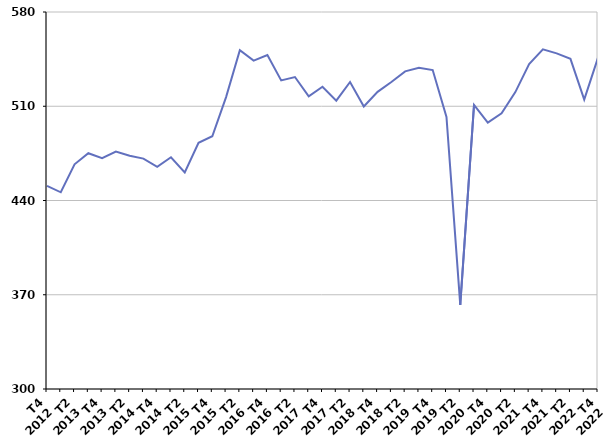
| Category | Ensemble des sorties de catégories A, B, C |
|---|---|
| T4
2012 | 450.8 |
| T1
2013 | 446.1 |
| T2
2013 | 466.9 |
| T3
2013 | 475.1 |
| T4
2013 | 471.4 |
| T1
2014 | 476.4 |
| T2
2014 | 473.2 |
| T3
2014 | 471.1 |
| T4
2014 | 465 |
| T1
2015 | 472.1 |
| T2
2015 | 460.9 |
| T3
2015 | 482.9 |
| T4
2015 | 487.7 |
| T1
2016 | 516.8 |
| T2
2016 | 551.6 |
| T3
2016 | 543.9 |
| T4
2016 | 548 |
| T1
2017 | 529.2 |
| T2
2017 | 531.7 |
| T3
2017 | 517.3 |
| T4
2017 | 524.5 |
| T1
2018 | 514.2 |
| T2
2018 | 528 |
| T3
2018 | 509.8 |
| T4
2018 | 520.7 |
| T1
2019 | 528 |
| T2
2019 | 535.9 |
| T3
2019 | 538.5 |
| T4
2019 | 536.9 |
| T1
2020 | 502.1 |
| T2
2020 | 362.5 |
| T3
2020 | 511 |
| T4
2020 | 497.9 |
| T1
2021 | 504.7 |
| T2
2021 | 520.5 |
| T3
2021 | 541.4 |
| T4
2021 | 552.3 |
| T1
2022 | 549.3 |
| T2
2022 | 545.2 |
| T3
2022 | 515 |
| T4
2022 | 546 |